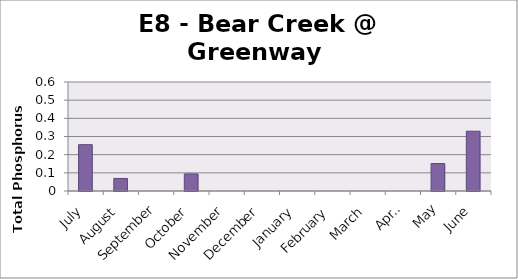
| Category | Phosphorus (mg/L) |
|---|---|
| July | 0.255 |
| August | 0.069 |
| September | 0 |
| October | 0.094 |
| November | 0 |
| December | 0 |
| January | 0 |
| February | 0 |
| March | 0 |
| April | 0 |
| May | 0.151 |
| June | 0.329 |